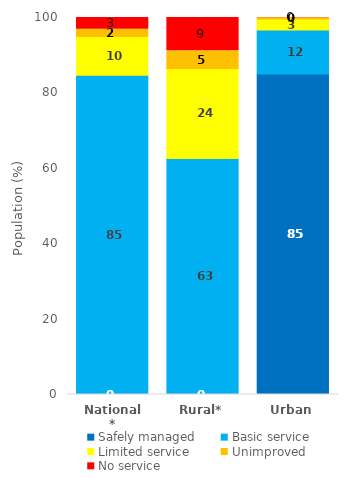
| Category | Safely managed | Basic service | Limited service | Unimproved | No service |
|---|---|---|---|---|---|
| National* | 0 | 84.697 | 10.275 | 1.882 | 3.146 |
| Rural* | 0 | 62.626 | 23.877 | 4.708 | 8.789 |
| Urban | 85.025 | 11.661 | 2.886 | 0.347 | 0.081 |